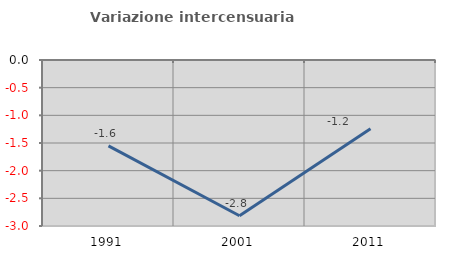
| Category | Variazione intercensuaria annua |
|---|---|
| 1991.0 | -1.551 |
| 2001.0 | -2.814 |
| 2011.0 | -1.241 |